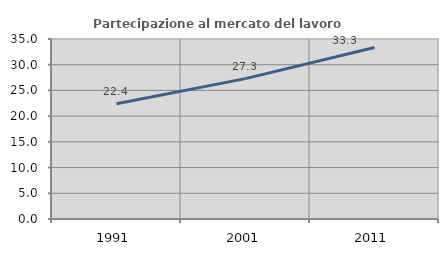
| Category | Partecipazione al mercato del lavoro  femminile |
|---|---|
| 1991.0 | 22.414 |
| 2001.0 | 27.296 |
| 2011.0 | 33.333 |